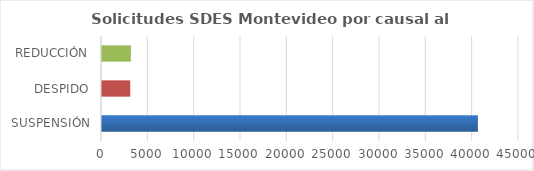
| Category | MONTEVIDEO |
|---|---|
| SUSPENSIÓN | 40565 |
| DESPIDO | 3047 |
| REDUCCIÓN | 3117 |